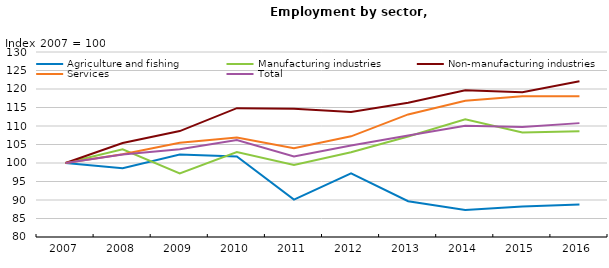
| Category | Agriculture and fishing  | Manufacturing industries | Non-manufacturing industries | Services | Total |
|---|---|---|---|---|---|
| 2007.0 | 100 | 100 | 100 | 100 | 100 |
| 2008.0 | 98.569 | 103.7 | 105.402 | 102.366 | 102.279 |
| 2009.0 | 102.297 | 97.178 | 108.624 | 105.474 | 103.689 |
| 2010.0 | 101.749 | 102.943 | 114.826 | 106.905 | 106.233 |
| 2011.0 | 90.122 | 99.467 | 114.656 | 103.99 | 101.773 |
| 2012.0 | 97.19 | 102.891 | 113.76 | 107.205 | 104.749 |
| 2013.0 | 89.662 | 107.142 | 116.279 | 113.134 | 107.462 |
| 2014.0 | 87.33 | 111.814 | 119.671 | 116.804 | 110.073 |
| 2015.0 | 88.266 | 108.26 | 119.138 | 118.02 | 109.763 |
| 2016.0 | 88.779 | 108.57 | 122.093 | 118.007 | 110.778 |